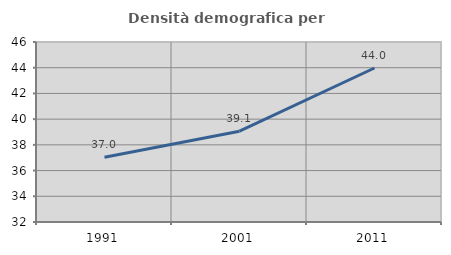
| Category | Densità demografica |
|---|---|
| 1991.0 | 37.037 |
| 2001.0 | 39.064 |
| 2011.0 | 43.977 |